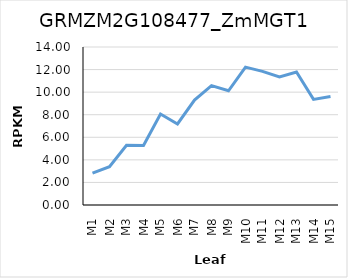
| Category | GRMZM2G108477_ZmMGT1 |
|---|---|
| M1 | 2.824 |
| M2 | 3.394 |
| M3 | 5.288 |
| M4 | 5.282 |
| M5 | 8.064 |
| M6 | 7.178 |
| M7 | 9.303 |
| M8 | 10.581 |
| M9 | 10.121 |
| M10 | 12.213 |
| M11 | 11.843 |
| M12 | 11.34 |
| M13 | 11.79 |
| M14 | 9.357 |
| M15 | 9.617 |